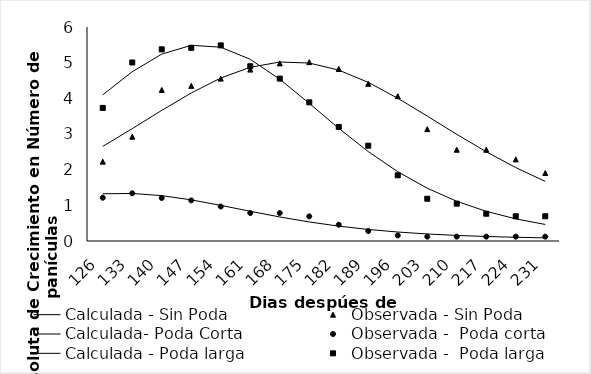
| Category | Calculada - Sin Poda | Observada - Sin Poda | Calculada- Poda Corta | Observada -  Poda corta | Calculada - Poda larga | Observada -  Poda larga |
|---|---|---|---|---|---|---|
| 126.0 | 2.652 | 2.225 | 1.324 | 1.214 | 4.098 | 3.731 |
| 133.0 | 3.151 | 2.924 | 1.333 | 1.338 | 4.746 | 5.005 |
| 140.0 | 3.663 | 4.235 | 1.272 | 1.206 | 5.24 | 5.374 |
| 147.0 | 4.151 | 4.35 | 1.153 | 1.138 | 5.486 | 5.417 |
| 154.0 | 4.569 | 4.553 | 0.999 | 0.966 | 5.434 | 5.485 |
| 161.0 | 4.871 | 4.806 | 0.833 | 0.784 | 5.094 | 4.899 |
| 168.0 | 5.018 | 4.98 | 0.674 | 0.784 | 4.536 | 4.553 |
| 175.0 | 4.99 | 5.015 | 0.534 | 0.69 | 3.859 | 3.887 |
| 182.0 | 4.791 | 4.824 | 0.417 | 0.456 | 3.159 | 3.199 |
| 189.0 | 4.448 | 4.407 | 0.324 | 0.28 | 2.507 | 2.671 |
| 196.0 | 4.002 | 4.06 | 0.252 | 0.157 | 1.943 | 1.842 |
| 203.0 | 3.502 | 3.136 | 0.197 | 0.122 | 1.48 | 1.185 |
| 210.0 | 2.991 | 2.559 | 0.156 | 0.122 | 1.114 | 1.047 |
| 217.0 | 2.503 | 2.559 | 0.126 | 0.122 | 0.832 | 0.765 |
| 224.0 | 2.059 | 2.288 | 0.104 | 0.122 | 0.621 | 0.693 |
| 231.0 | 1.671 | 1.905 | 0.089 | 0.122 | 0.464 | 0.693 |